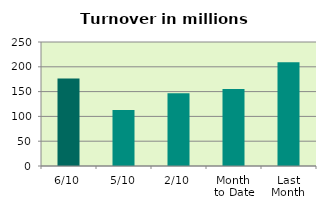
| Category | Series 0 |
|---|---|
| 6/10 | 176.24 |
| 5/10 | 113.013 |
| 2/10 | 146.616 |
| Month 
to Date | 155.038 |
| Last
Month | 209.117 |